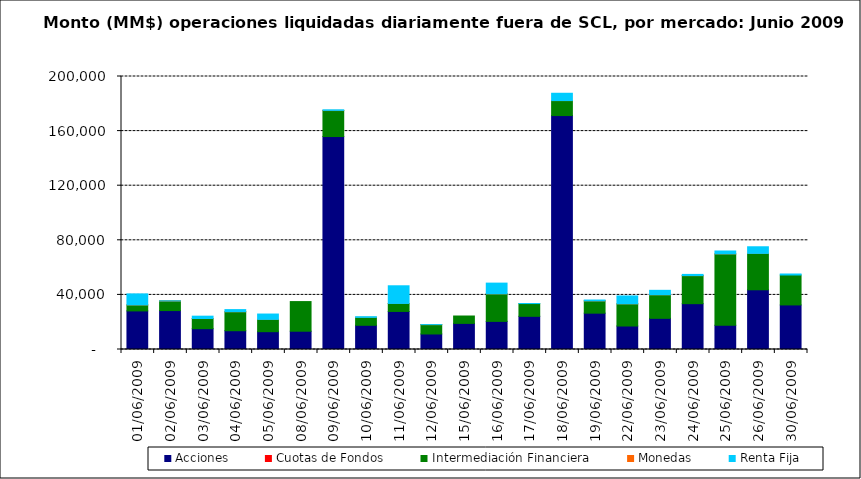
| Category | Acciones | Cuotas de Fondos | Intermediación Financiera | Monedas | Renta Fija |
|---|---|---|---|---|---|
| 01/06/2009 | 28269.476 | 0 | 4385.331 | 1.448 | 8080.716 |
| 02/06/2009 | 28516.529 | 0 | 7023.671 | 13.221 | 107.006 |
| 03/06/2009 | 15254.912 | 0 | 7423.215 | 13.629 | 1725.593 |
| 04/06/2009 | 13759.633 | 0 | 13908.34 | 13.485 | 1556.395 |
| 05/06/2009 | 13053.37 | 0 | 8997.206 | 9.903 | 3922.306 |
| 08/06/2009 | 13391.263 | 0 | 21716.772 | 0 | 0 |
| 09/06/2009 | 156016.425 | 0 | 19016.125 | 125.64 | 436.596 |
| 10/06/2009 | 17727.222 | 0 | 5772.409 | 13.32 | 511.142 |
| 11/06/2009 | 27873.583 | 0 | 5862.432 | 1.8 | 12946.559 |
| 12/06/2009 | 11370.355 | 0 | 6843.697 | 1.815 | 33.597 |
| 15/06/2009 | 19127.446 | 0 | 5407.527 | 0 | 0 |
| 16/06/2009 | 20592.285 | 0 | 20186.258 | 4.68 | 7851.724 |
| 17/06/2009 | 24307.341 | 0 | 9345.889 | 0 | 21.479 |
| 18/06/2009 | 171384.854 | 0 | 10973.868 | 3.273 | 5357.557 |
| 19/06/2009 | 26618.029 | 0 | 8994.389 | 2.551 | 634.108 |
| 22/06/2009 | 17207.221 | 0 | 16253.359 | 1.895 | 5772.394 |
| 23/06/2009 | 22830.163 | 0 | 17276.075 | 4.324 | 3240.573 |
| 24/06/2009 | 33579.604 | 0 | 20546.566 | 8.28 | 884.234 |
| 25/06/2009 | 17761.982 | 0 | 52285.599 | 13.32 | 2102.691 |
| 26/06/2009 | 43744.412 | 0 | 26654.544 | 0.72 | 4863.769 |
| 30/06/2009 | 32650.287 | 0 | 21933.628 | 0 | 727.56 |